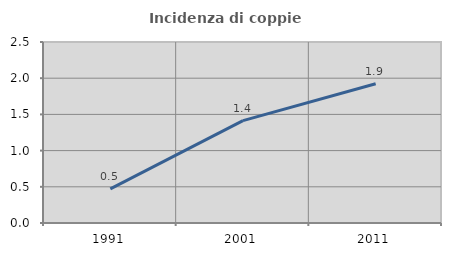
| Category | Incidenza di coppie miste |
|---|---|
| 1991.0 | 0.471 |
| 2001.0 | 1.413 |
| 2011.0 | 1.924 |